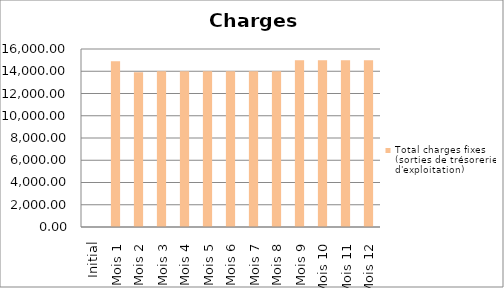
| Category | Total charges fixes (sorties de trésorerie d'exploitation) |
|---|---|
| Initial | 0 |
| Mois 1 | 14900 |
| Mois 2 | 13900 |
| Mois 3 | 14000 |
| Mois 4 | 14000 |
| Mois 5 | 14000 |
| Mois 6 | 14000 |
| Mois 7 | 14000 |
| Mois 8 | 14000 |
| Mois 9 | 15000 |
| Mois 10 | 15000 |
| Mois 11 | 15000 |
| Mois 12 | 15000 |